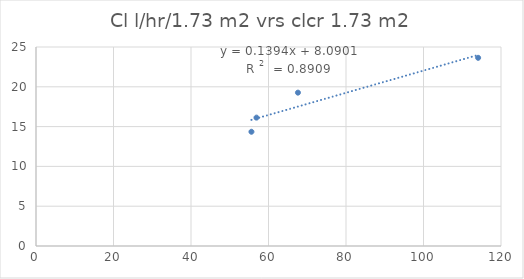
| Category | Series 0 |
|---|---|
| 55.6 | 14.352 |
| 56.9 | 16.128 |
| 67.6 | 19.266 |
| 114.1 | 23.64 |